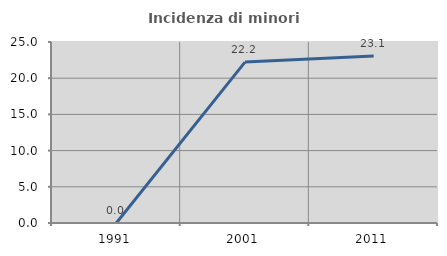
| Category | Incidenza di minori stranieri |
|---|---|
| 1991.0 | 0 |
| 2001.0 | 22.222 |
| 2011.0 | 23.077 |